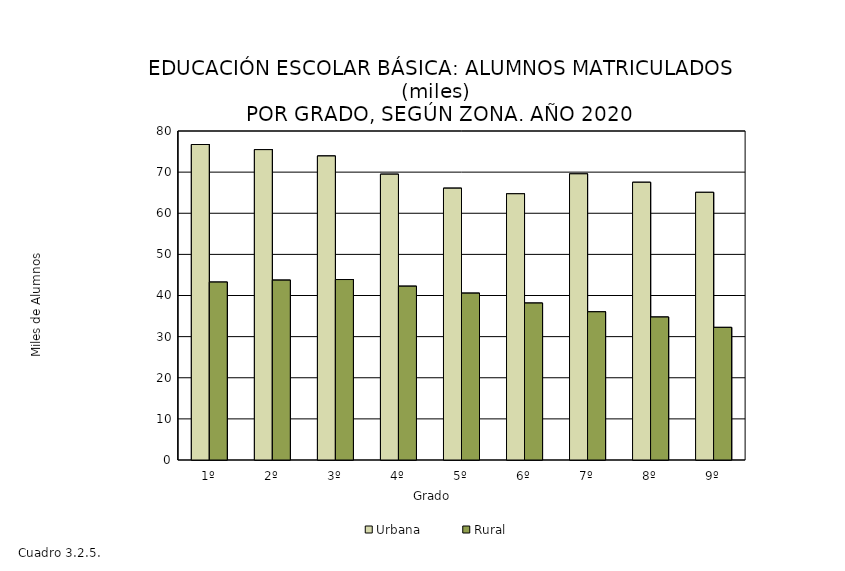
| Category | Urbana | Rural |
|---|---|---|
| 1º | 76.714 | 43.255 |
| 2º | 75.47 | 43.733 |
| 3º | 73.923 | 43.882 |
| 4º | 69.496 | 42.259 |
| 5º | 66.092 | 40.568 |
| 6º | 64.735 | 38.154 |
| 7º | 69.583 | 36.038 |
| 8º | 67.527 | 34.758 |
| 9º | 65.08 | 32.248 |